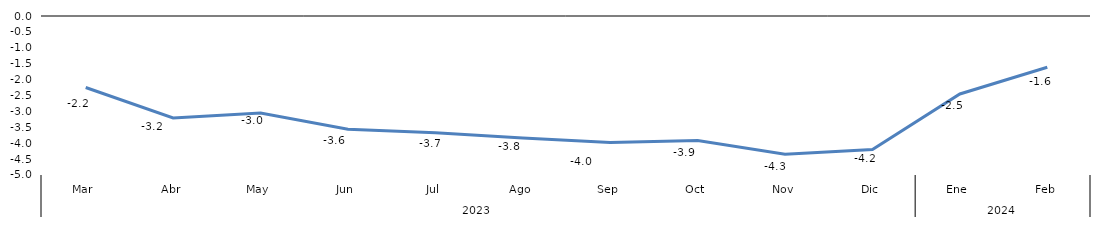
| Category | Bogotá |
|---|---|
| 0 | -2.248 |
| 1 | -3.204 |
| 2 | -3.048 |
| 3 | -3.561 |
| 4 | -3.67 |
| 5 | -3.834 |
| 6 | -3.981 |
| 7 | -3.916 |
| 8 | -4.347 |
| 9 | -4.195 |
| 10 | -2.453 |
| 11 | -1.611 |